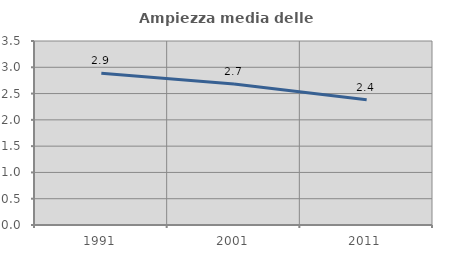
| Category | Ampiezza media delle famiglie |
|---|---|
| 1991.0 | 2.887 |
| 2001.0 | 2.682 |
| 2011.0 | 2.382 |